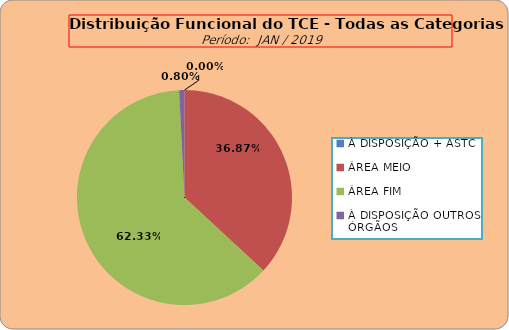
| Category | Series 0 |
|---|---|
| À DISPOSIÇÃO + ASTC | 0 |
| ÁREA MEIO | 184 |
| ÁREA FIM | 311 |
| À DISPOSIÇÃO OUTROS ÓRGÃOS | 4 |